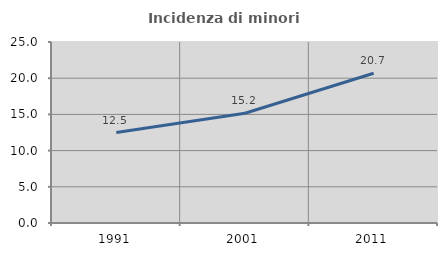
| Category | Incidenza di minori stranieri |
|---|---|
| 1991.0 | 12.5 |
| 2001.0 | 15.152 |
| 2011.0 | 20.69 |